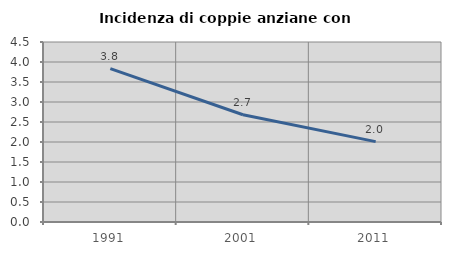
| Category | Incidenza di coppie anziane con figli |
|---|---|
| 1991.0 | 3.835 |
| 2001.0 | 2.681 |
| 2011.0 | 2.01 |